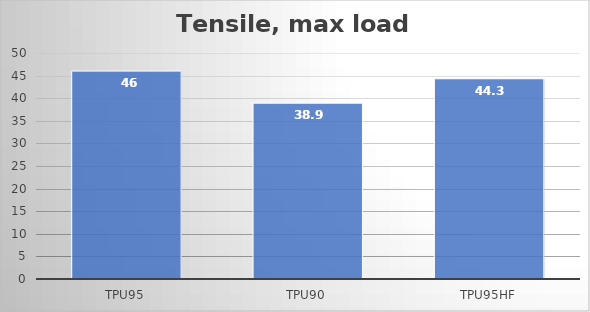
| Category | Average |
|---|---|
| TPU95 | 46 |
| TPU90 | 38.9 |
| TPU95HF | 44.3 |